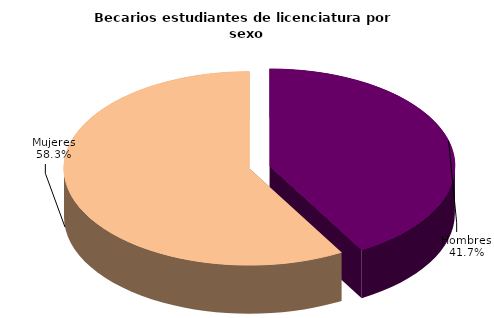
| Category | Series 0 |
|---|---|
| Hombres | 37891 |
| Mujeres | 52935 |